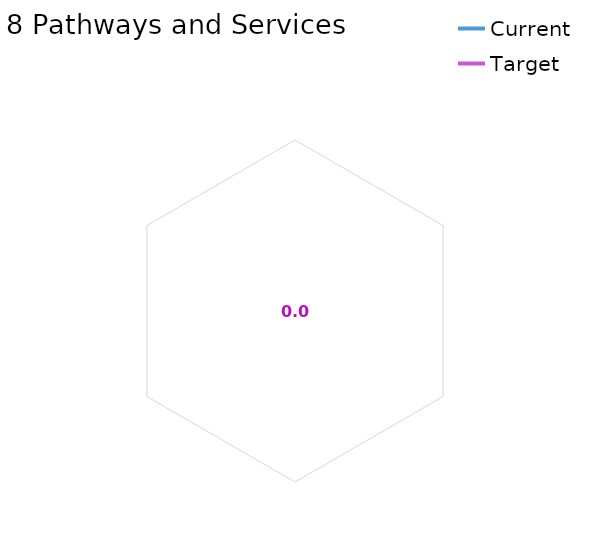
| Category | Current | Target |
|---|---|---|
| 8 Pathways and Services average | 0 | 0 |
| 8.1 Extent of core technology offer | 0 | 0 |
| 8.2 Integration and digital technology | 0 | 0 |
| 8.3 Effective and integrated current service | 0 | 0 |
| 8.4 Clear plan and mechanism for improvement | 0 | 0 |
| 8.5 Sustainable funding model for the service | 0 | 0 |